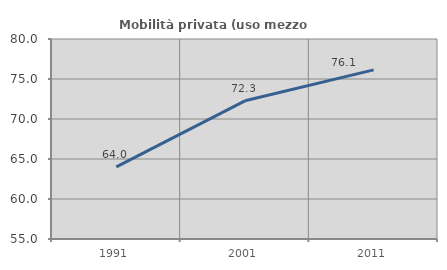
| Category | Mobilità privata (uso mezzo privato) |
|---|---|
| 1991.0 | 64.014 |
| 2001.0 | 72.273 |
| 2011.0 | 76.139 |